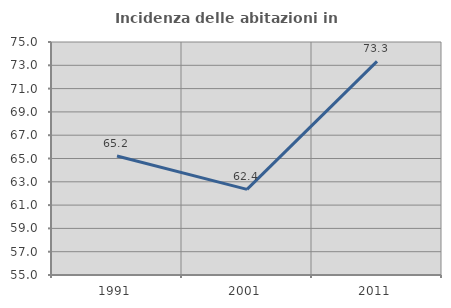
| Category | Incidenza delle abitazioni in proprietà  |
|---|---|
| 1991.0 | 65.217 |
| 2001.0 | 62.353 |
| 2011.0 | 73.333 |